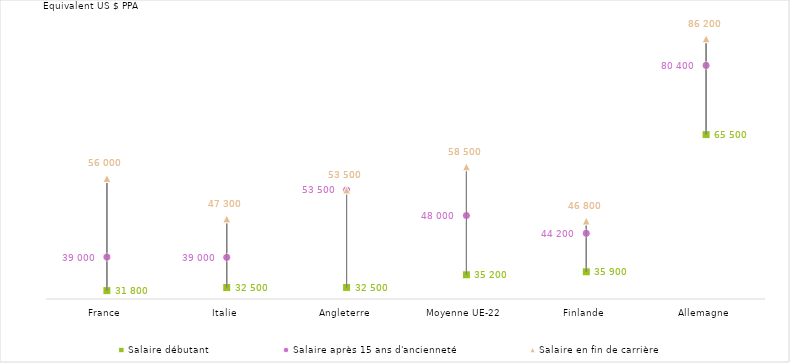
| Category | Salaire débutant | Salaire après 15 ans d'ancienneté | Salaire en fin de carrière |
|---|---|---|---|
| France | 31803.029 | 39048.941 | 56008.901 |
| Italie | 32480.975 | 38983.731 | 47287.2 |
| Angleterre | 32492.922 | 53528.252 | 53528.252 |
| Moyenne UE-22 | 35219.62 | 48014.673 | 58529.965 |
| Finlande | 35864.972 | 44179.775 | 46830.562 |
| Allemagne | 65475.236 | 80407.412 | 86171.326 |